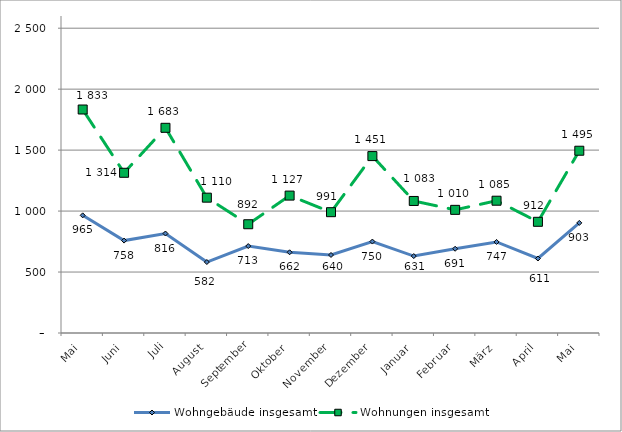
| Category | Wohngebäude insgesamt | Wohnungen insgesamt |
|---|---|---|
| Mai | 965 | 1833 |
| Juni | 758 | 1314 |
| Juli | 816 | 1683 |
| August | 582 | 1110 |
| September | 713 | 892 |
| Oktober | 662 | 1127 |
| November | 640 | 991 |
| Dezember | 750 | 1451 |
| Januar | 631 | 1083 |
| Februar | 691 | 1010 |
| März | 747 | 1085 |
| April | 611 | 912 |
| Mai | 903 | 1495 |